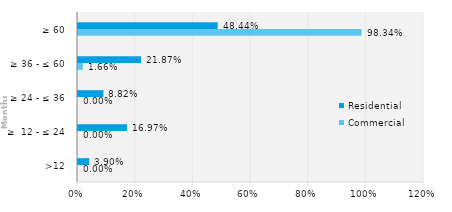
| Category | Commercial | Residential |
|---|---|---|
| >12 | 0 | 0.039 |
| ≥  12 - ≤ 24 | 0 | 0.17 |
| ≥ 24 - ≤ 36 | 0 | 0.088 |
| ≥ 36 - ≤ 60 | 0.017 | 0.219 |
| ≥ 60 | 0.983 | 0.484 |